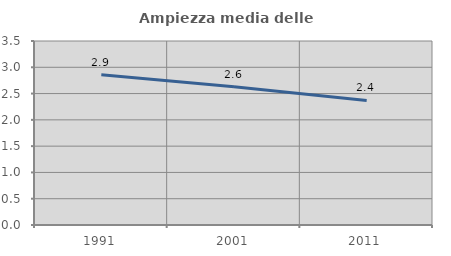
| Category | Ampiezza media delle famiglie |
|---|---|
| 1991.0 | 2.859 |
| 2001.0 | 2.631 |
| 2011.0 | 2.37 |